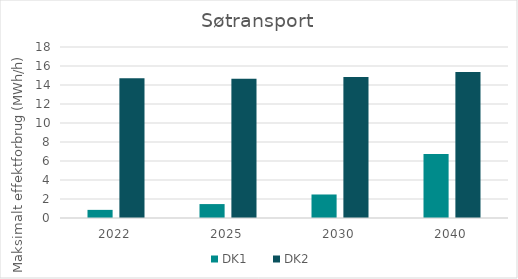
| Category | DK1 | DK2 |
|---|---|---|
| 2022.0 | 0.856 | 14.721 |
| 2025.0 | 1.465 | 14.658 |
| 2030.0 | 2.475 | 14.831 |
| 2040.0 | 6.729 | 15.358 |